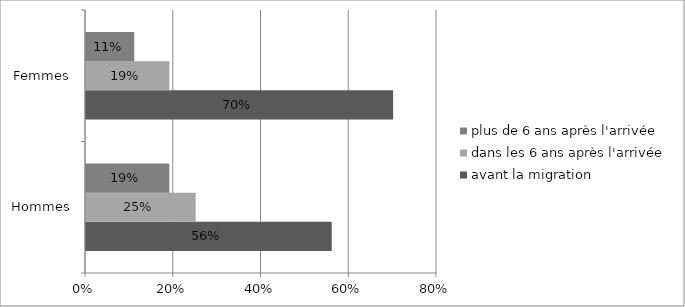
| Category | avant la migration | dans les 6 ans après l'arrivée | plus de 6 ans après l'arrivée |
|---|---|---|---|
| Hommes | 0.56 | 0.25 | 0.19 |
| Femmes | 0.7 | 0.19 | 0.11 |